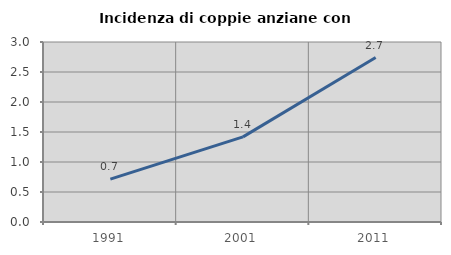
| Category | Incidenza di coppie anziane con figli |
|---|---|
| 1991.0 | 0.713 |
| 2001.0 | 1.419 |
| 2011.0 | 2.741 |